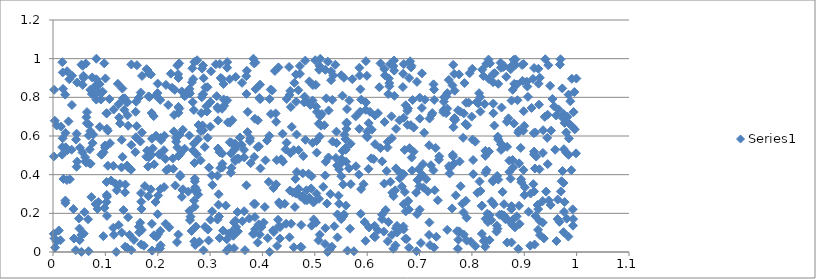
| Category | Series 0 |
|---|---|
| 0.5160474913337167 | 0.337 |
| 0.09617015705245335 | 0.082 |
| 0.9923903750390449 | 0.647 |
| 0.898281023670158 | 0.628 |
| 0.5591254495137288 | 0.529 |
| 0.8788413664616356 | 0.168 |
| 0.7127671088872979 | 0.377 |
| 0.5207826971131438 | 0.467 |
| 0.07418495562088356 | 0.817 |
| 0.5432654052218046 | 0.195 |
| 0.5081474548097578 | 0.943 |
| 0.23122237968736337 | 0.709 |
| 0.3169787551682983 | 0.183 |
| 0.23888999347084172 | 0.92 |
| 0.998885889811188 | 0.51 |
| 0.051441538219130334 | 0.539 |
| 0.6867950264548931 | 0.786 |
| 0.7003428091250541 | 0.798 |
| 0.8137104538907994 | 0.822 |
| 0.4638755823342835 | 0.918 |
| 0.014271669529187458 | 0.061 |
| 0.16392547301522664 | 0.131 |
| 0.48386084662999385 | 0.319 |
| 0.41611421413591265 | 0.714 |
| 0.8165534051275879 | 0.316 |
| 0.2219852981692495 | 0.127 |
| 0.6286246859752543 | 0.469 |
| 0.980182902136996 | 0.514 |
| 0.5465048586602486 | 0.427 |
| 0.26888465898112823 | 0.734 |
| 0.9289868362774674 | 0.428 |
| 0.5425743684143259 | 0.447 |
| 0.904747649500119 | 0.881 |
| 0.4972317677143836 | 0.256 |
| 0.5022900484589893 | 0.152 |
| 0.026913533181302074 | 0.935 |
| 0.5018402374626736 | 0.865 |
| 0.48200983674703113 | 0.58 |
| 0.43437397794785293 | 0.245 |
| 0.16758575639879836 | 0.825 |
| 0.9059215314509445 | 0.856 |
| 0.6445165085438551 | 0.363 |
| 0.848225839556311 | 0.394 |
| 0.45776737283951885 | 0.308 |
| 0.8673675034753366 | 0.049 |
| 0.3928753439997401 | 0.143 |
| 0.02354804728374016 | 0.253 |
| 0.6661456146922734 | 0.406 |
| 0.6423620065852867 | 0.857 |
| 0.6727755118670857 | 0.069 |
| 0.48175968026749183 | 0.99 |
| 0.2972427502199886 | 0.06 |
| 0.6695533480251125 | 0.117 |
| 0.14208918352991717 | 0.774 |
| 0.5264158143715961 | 0.732 |
| 0.14231449435864685 | 0.707 |
| 0.5614941263185844 | 0.739 |
| 0.9749478734390072 | 0.357 |
| 0.6698155773407001 | 0.972 |
| 0.0462499439189461 | 0.468 |
| 0.4424278551407389 | 0.25 |
| 0.271633494771119 | 0.036 |
| 0.7622133983896074 | 0.225 |
| 0.056687365258446754 | 0.864 |
| 0.4044717226755219 | 0.233 |
| 0.128133986302983 | 0.665 |
| 0.9827619591194117 | 0.7 |
| 0.27142372187796016 | 0.334 |
| 0.34041110181162393 | 0.567 |
| 0.858628139896921 | 0.311 |
| 0.3246781543375922 | 0.111 |
| 0.7634332874055841 | 0.503 |
| 0.14042899651690843 | 0.777 |
| 0.24586088202653633 | 0.831 |
| 0.5506197301472198 | 0.914 |
| 0.869822549361101 | 0.692 |
| 0.05441939195161549 | 0.001 |
| 0.20204904992688266 | 0.016 |
| 0.7668411060382312 | 0.693 |
| 0.11922566211693186 | 0.354 |
| 0.8784574600127304 | 0.436 |
| 0.7101605642942721 | 0.788 |
| 0.7243952046138283 | 0.719 |
| 0.6800469891440387 | 0.9 |
| 0.204041784334548 | 0.503 |
| 0.20483202731022032 | 0.787 |
| 0.06501076618932367 | 0.724 |
| 0.7887770125713018 | 0.772 |
| 0.3690895068747635 | 0.91 |
| 0.69974024174185 | 0.34 |
| 0.5608721459330146 | 0.67 |
| 0.19231547392342319 | 0.703 |
| 0.6151291307687713 | 0.706 |
| 0.5310625850628673 | 0.889 |
| 0.5040898804009066 | 0.724 |
| 0.3842550488166191 | 0.095 |
| 0.01995157591183616 | 0.378 |
| 0.08657769169448992 | 0.258 |
| 0.023647442385348882 | 0.266 |
| 0.10226751556213132 | 0.718 |
| 0.7157559767093521 | 0.313 |
| 0.8504350243161668 | 0.374 |
| 0.9653542186787719 | 0.738 |
| 0.5855189668198598 | 0.913 |
| 0.2408352356293808 | 0.976 |
| 0.3692961089751641 | 0.345 |
| 0.4202269776407961 | 0.112 |
| 0.2606275598536397 | 0.213 |
| 0.445205842773467 | 0.147 |
| 0.8281003494035778 | 0.423 |
| 0.9681286392194016 | 0.97 |
| 0.9609840386519294 | 0.706 |
| 0.492944353848661 | 0.329 |
| 0.5201014133307867 | 0.123 |
| 0.17541336736646163 | 0.341 |
| 0.13376644527218606 | 0.794 |
| 0.5684911881025859 | 0.56 |
| 0.2728434351056739 | 0.132 |
| 0.8832550699215823 | 0.968 |
| 0.6470820867274772 | 0.589 |
| 0.19983293324825735 | 0.195 |
| 0.7004954527130517 | 0.69 |
| 0.11100819530590189 | 0.37 |
| 0.994160744379721 | 0.724 |
| 0.863801572871504 | 0.17 |
| 0.10889489817656695 | 0.563 |
| 0.1380148396396258 | 0.349 |
| 0.2145633636056936 | 0.481 |
| 0.8931110382390102 | 0.538 |
| 0.19268003356132068 | 0.086 |
| 0.3039391390445202 | 0.211 |
| 0.6423124380492489 | 0.873 |
| 0.1646106853342384 | 0.101 |
| 0.5528822564993626 | 0.808 |
| 0.6949786338030213 | 0.88 |
| 0.2297097580858506 | 0.431 |
| 0.6552331101634565 | 0.637 |
| 0.8370217825005049 | 0.165 |
| 0.7278284886980528 | 0.84 |
| 0.8403962128402033 | 0.878 |
| 0.6391220886693384 | 0.055 |
| 0.7757754596767555 | 0.106 |
| 0.09914752032713248 | 0.551 |
| 0.8594910772701327 | 0.956 |
| 0.7691311222818694 | 0.293 |
| 0.200906322155457 | 0.292 |
| 0.6766608967041786 | 0.731 |
| 0.21171164388960118 | 0.527 |
| 0.1495388028722736 | 0.97 |
| 0.8502898424177602 | 0.87 |
| 0.2024455598627981 | 0.506 |
| 0.896706121588745 | 0.885 |
| 0.13460893616439917 | 0.217 |
| 0.115838791917242 | 0.737 |
| 0.5296197261146912 | 0.3 |
| 0.9188620540828366 | 0.313 |
| 0.5530700897507589 | 0.523 |
| 0.3530607829567656 | 0.107 |
| 0.32341298981843236 | 0.457 |
| 0.34683716237224993 | 0.531 |
| 0.05817710978111046 | 0.911 |
| 0.3488813154143958 | 0.906 |
| 0.45486561540001924 | 0.146 |
| 0.31815171937131514 | 0.517 |
| 0.2054990558264751 | 0.035 |
| 0.9964427188102639 | 0.634 |
| 0.6502840728676508 | 0.289 |
| 0.6353830752806258 | 0.217 |
| 0.0311610626857326 | 0.893 |
| 0.09954092345907817 | 0.541 |
| 0.4880577461002289 | 0.405 |
| 0.5339586292859538 | 0.571 |
| 0.4957916930036197 | 0.565 |
| 0.10299538141624986 | 0.187 |
| 0.990803139751708 | 0.896 |
| 0.2875465384756598 | 0.899 |
| 0.9069388965197343 | 0.802 |
| 0.14443109365969997 | 0.436 |
| 0.7454183412681402 | 0.723 |
| 0.7754573346771144 | 0.919 |
| 0.3905756669890822 | 0.542 |
| 0.32027742699424466 | 0.9 |
| 0.669793534152688 | 0.694 |
| 0.9930435932296257 | 0.136 |
| 0.2898198921892585 | 0.543 |
| 0.0890437311073532 | 0.868 |
| 0.7898784925233262 | 0.178 |
| 0.7529351361444985 | 0.822 |
| 0.38549033543381894 | 0.689 |
| 0.6412420843938199 | 0.898 |
| 0.8557094393062145 | 0.528 |
| 0.7277664527650842 | 0.023 |
| 0.92278826387854 | 0.494 |
| 0.677412698204643 | 0.261 |
| 0.2627592418157719 | 0.183 |
| 0.39569713690554187 | 0.791 |
| 0.45998485012497536 | 0.527 |
| 0.054396339936149674 | 0.969 |
| 0.5653939416307774 | 0.432 |
| 0.2483012398480593 | 0.324 |
| 0.6205030739863668 | 0.718 |
| 0.36173882179329186 | 0.159 |
| 0.669702321534722 | 0.247 |
| 0.8470437734888367 | 0.106 |
| 0.34972731973225835 | 0.129 |
| 0.295820691912106 | 0.116 |
| 0.5101152170094726 | 0.702 |
| 0.5870672850805322 | 0.842 |
| 0.23964664733678687 | 0.496 |
| 0.7370799990543205 | 0.477 |
| 0.21502749290350065 | 0.146 |
| 0.4304902103414102 | 0.955 |
| 0.3140775212782264 | 0.749 |
| 0.1278181677584258 | 0.352 |
| 0.6571849410481505 | 0.101 |
| 0.2676599819427584 | 0.894 |
| 0.6681986659356463 | 0.853 |
| 0.29541667375366776 | 0.591 |
| 0.3909114733745317 | 0.049 |
| 0.7956458986887804 | 0.925 |
| 0.050868496379963934 | 0.061 |
| 0.9752338337016192 | 0.714 |
| 0.25836940221235194 | 0.312 |
| 0.9957257659108527 | 0.828 |
| 0.969218281494824 | 0.997 |
| 0.23361494935856852 | 0.344 |
| 0.2513389103709913 | 0.534 |
| 0.8104681872536187 | 0.306 |
| 0.8714987426617473 | 0.473 |
| 0.45169785512974225 | 0.076 |
| 0.5006893211606837 | 0.992 |
| 0.5412260884766051 | 0.623 |
| 0.41302448046518114 | 0.601 |
| 0.38558540759235727 | 0.181 |
| 0.9417043012539531 | 0.312 |
| 0.7529102056548332 | 0.115 |
| 0.04365851513771701 | 0.01 |
| 0.4651357135091385 | 0.608 |
| 0.03654850122257358 | 0.912 |
| 0.003374960170800967 | 0.679 |
| 0.29507120769769013 | 0.852 |
| 0.07694055137947431 | 0.607 |
| 0.6470160000354761 | 0.088 |
| 0.07009927439325114 | 0.531 |
| 0.8218487654604174 | 0.91 |
| 0.12543360969417128 | 0.765 |
| 0.433631274281139 | 0.128 |
| 0.5200169661153189 | 0.942 |
| 0.2910380318669744 | 0.851 |
| 0.8399748398357505 | 0.365 |
| 0.22504576000953158 | 0.922 |
| 0.011116618831832237 | 0.111 |
| 0.017495180996623727 | 0.504 |
| 0.09283950037387911 | 0.504 |
| 0.315195806480009 | 0.74 |
| 0.524487382952105 | 0 |
| 0.007008232881922649 | 0.654 |
| 0.830661720581235 | 0.155 |
| 0.123875482949651 | 0.87 |
| 0.620461965117346 | 0.113 |
| 0.4598175828204688 | 0.025 |
| 0.24605823333379706 | 0.285 |
| 0.8779567132965074 | 0.839 |
| 0.9749534379046145 | 0.102 |
| 0.16888233264995067 | 0.223 |
| 0.7976996871791326 | 0.054 |
| 0.4858062249109364 | 0.779 |
| 0.8808032482029828 | 0.87 |
| 0.16969893811262626 | 0.114 |
| 0.03615307680729607 | 0.76 |
| 0.5715945716080069 | 0.894 |
| 0.8613049858235846 | 0.247 |
| 0.5090588506498519 | 0.963 |
| 0.3550713572500811 | 0.481 |
| 0.35699600953956856 | 0.592 |
| 0.27006518773886623 | 0.461 |
| 0.6003519915042398 | 0.623 |
| 0.10270330255344684 | 0.295 |
| 0.469063429481822 | 0.327 |
| 0.3327974064358721 | 0.982 |
| 0.32333862595797835 | 0.509 |
| 0.2864035717593877 | 0.965 |
| 0.3818654988153457 | 0.094 |
| 0.7884715547880564 | 0.265 |
| 0.1308672265532792 | 0.437 |
| 0.4463411103876339 | 0.792 |
| 0.18440315167423849 | 0.802 |
| 0.05056367064041212 | 0.121 |
| 0.2847482210653076 | 0.949 |
| 0.8248048724806967 | 0.062 |
| 0.3981471000494605 | 0.129 |
| 0.6734767566700215 | 0.21 |
| 0.19996027802215033 | 0.871 |
| 0.39469660803289497 | 0.091 |
| 0.18319324629977196 | 0.924 |
| 0.9011738566486307 | 0.335 |
| 0.023256224536537196 | 0.814 |
| 0.6985202825800196 | 0.429 |
| 0.9272997631414656 | 0.871 |
| 0.600496804257591 | 0.594 |
| 0.894524486939494 | 0.361 |
| 0.14952102701992398 | 0.554 |
| 0.056969060203974076 | 0.963 |
| 0.43842421718684355 | 0.612 |
| 0.2694738156720594 | 0.266 |
| 0.16653644974326176 | 0.151 |
| 0.7670793743864562 | 0.834 |
| 0.2709828725751994 | 0.366 |
| 0.1208106366021321 | 0 |
| 0.7281010862305417 | 0.786 |
| 0.49568842099406674 | 0.784 |
| 0.8190396635869489 | 0.094 |
| 0.23948441779423135 | 0.75 |
| 0.30436015564496466 | 0.347 |
| 0.13275958174271907 | 0.492 |
| 0.347809619524413 | 0.471 |
| 0.9726278440588686 | 0.846 |
| 0.771581626974921 | 0.108 |
| 0.6799053029132318 | 0.022 |
| 0.831676544788053 | 0.995 |
| 0.2064527116754289 | 0.579 |
| 0.1896499647613924 | 0.007 |
| 0.5973174116906521 | 0.735 |
| 0.2539689276889576 | 0.812 |
| 0.7045289284485426 | 0.924 |
| 0.9571639279005842 | 0.753 |
| 0.4508486974684537 | 0.957 |
| 0.06692934471110834 | 0.169 |
| 0.815909478625998 | 0.801 |
| 0.683348130637034 | 0.656 |
| 0.06802094630610855 | 0.602 |
| 0.8553141068305042 | 0.952 |
| 0.9300199173017595 | 0.088 |
| 0.029642715605264103 | 0.675 |
| 0.7781662520969763 | 0.726 |
| 0.28733792452560636 | 0.009 |
| 0.6718831538702215 | 0.311 |
| 0.9359147373889912 | 0.63 |
| 0.27080704743544537 | 0.379 |
| 0.8272430935822584 | 0.054 |
| 0.8912023832098556 | 0.145 |
| 0.651175929641434 | 0.991 |
| 0.6605683099838938 | 0.415 |
| 0.6479803578562588 | 0.307 |
| 0.6978052739418573 | 0.376 |
| 0.34763961310599034 | 0.56 |
| 0.5951255803245962 | 0.155 |
| 0.17871630143313555 | 0.946 |
| 0.7831721456663625 | 0.591 |
| 0.06885527749311571 | 0.658 |
| 0.4619466549278327 | 0.233 |
| 0.12638935672683194 | 0.695 |
| 0.12170842594978981 | 0.319 |
| 0.09491017696626791 | 0.829 |
| 0.11618112882881859 | 0.089 |
| 0.2646431597955212 | 0.109 |
| 0.09784340277218828 | 0.976 |
| 0.07325189888176786 | 0.284 |
| 0.18675792579572936 | 0.324 |
| 0.45351831289544176 | 0.511 |
| 0.16854728103935301 | 0.26 |
| 0.650036609704758 | 0.962 |
| 0.7088853075078477 | 0.617 |
| 0.03219710776726192 | 0.376 |
| 0.04003360642642828 | 0.07 |
| 0.6284006847252757 | 0.193 |
| 0.5309788797945314 | 0.935 |
| 0.51803318071659 | 0.656 |
| 0.9296853460210421 | 0.901 |
| 0.36658406106887786 | 0.01 |
| 0.5372916670756805 | 0.133 |
| 0.6735970478061628 | 0.759 |
| 0.19679150838179538 | 0.602 |
| 0.6850578520837944 | 0.489 |
| 0.17008010851534283 | 0.911 |
| 0.6809615487753453 | 0.537 |
| 0.045053675308869834 | 0.441 |
| 0.8753336812994185 | 0.222 |
| 0.8375936473239558 | 0.262 |
| 0.08164369475475719 | 0.862 |
| 0.8495161779024559 | 0.597 |
| 0.917183401545911 | 0.351 |
| 0.8800631287835413 | 0.665 |
| 0.528423706028977 | 0.012 |
| 0.9374902867449658 | 0.07 |
| 0.345660660344038 | 0.02 |
| 0.824348266542112 | 0.765 |
| 0.323439766440895 | 0.437 |
| 0.44418121442076497 | 0.531 |
| 0.13247364694846708 | 0.846 |
| 0.8528757800839457 | 0.193 |
| 0.963880348047381 | 0.271 |
| 0.4216448241569155 | 0.104 |
| 0.30071782806299296 | 0.167 |
| 0.6076774266423779 | 0.484 |
| 0.10286952712175035 | 0.637 |
| 0.3836723746024989 | 0.249 |
| 0.20547441863621885 | 0.59 |
| 0.2795370415685192 | 0.054 |
| 0.1683698710105307 | 0.039 |
| 0.3299490447380561 | 0.24 |
| 0.46897123646650607 | 0.527 |
| 0.9139200133723082 | 0.745 |
| 0.24296921735546417 | 0.391 |
| 0.6716193967894878 | 0.528 |
| 0.41575961734003797 | 0.84 |
| 0.826104817979002 | 0.172 |
| 0.7909610075081339 | 0.655 |
| 0.24138965574885907 | 0.605 |
| 0.6149737833819521 | 0.077 |
| 0.8569906977975642 | 0.193 |
| 0.35229186761567577 | 0.484 |
| 0.23687604639698667 | 0.051 |
| 0.17984516950711704 | 0.525 |
| 0.1869459057845515 | 0.919 |
| 0.7574187230055178 | 0.407 |
| 0.47977983258901546 | 0.774 |
| 0.4460203297958303 | 0.565 |
| 0.28606313682450313 | 0.814 |
| 0.7044642934123558 | 0.745 |
| 0.23761933564784965 | 0.965 |
| 0.5866683278944322 | 0.725 |
| 0.8777225424323545 | 0.476 |
| 0.6387521773593108 | 0.541 |
| 0.6754095427323042 | 0.067 |
| 0.9082136269626165 | 0.208 |
| 0.7562983639475634 | 0.444 |
| 0.2613956958475674 | 0.82 |
| 0.28418251842723774 | 0.8 |
| 0.4209025043203669 | 0.331 |
| 0.5513688865390692 | 0.481 |
| 0.22882730610412538 | 0.484 |
| 0.0635607361454843 | 0.462 |
| 0.6150896944945875 | 0.558 |
| 0.6405078566713799 | 0.155 |
| 0.15459181945530032 | 0.062 |
| 0.08187374565465644 | 0.856 |
| 0.06386510061728434 | 0.697 |
| 0.839939479589058 | 0.371 |
| 0.8870814634508708 | 0.785 |
| 0.6390742154956429 | 0.57 |
| 0.1958535835155274 | 0.258 |
| 0.0149356867256627 | 0.649 |
| 0.4022760473932533 | 0.152 |
| 0.18235212358293074 | 0.805 |
| 0.11484830745693508 | 0.125 |
| 0.6548874630980315 | 0.433 |
| 0.6125129183178596 | 0.48 |
| 0.1033068978502788 | 0.286 |
| 0.8856037798920223 | 0.185 |
| 0.8589752392401347 | 0.537 |
| 0.5603439172634667 | 0.637 |
| 0.2691186276788514 | 0.56 |
| 0.019219271684630446 | 0.844 |
| 0.45418904041043384 | 0.75 |
| 0.09247413655775782 | 0.504 |
| 0.7629756131911792 | 0.862 |
| 0.16029194987780782 | 0.966 |
| 0.10047352910613738 | 0.549 |
| 0.9770794814875846 | 0.258 |
| 0.46857486589279296 | 0.837 |
| 0.6141573629054858 | 0.135 |
| 0.2822003437319317 | 0.627 |
| 0.2866953437699181 | 0.63 |
| 0.27711145982672203 | 0.584 |
| 0.48938826633109933 | 0.281 |
| 0.3151420783906138 | 0.535 |
| 0.3694908725056497 | 0.818 |
| 0.8007114219355559 | 0.947 |
| 0.7680746477185068 | 0.683 |
| 0.6339319712132493 | 0.914 |
| 0.9437614926747709 | 0.591 |
| 0.9187034859591503 | 0.951 |
| 0.8939011450793218 | 0.376 |
| 0.4730619367290366 | 0.027 |
| 0.3379489651533709 | 0.669 |
| 0.3337282040417441 | 0.67 |
| 0.36103176026456174 | 0.875 |
| 0.34458976906588334 | 0.084 |
| 0.4559970263710701 | 0.647 |
| 0.6838612808895832 | 0.955 |
| 0.651935648049458 | 0.808 |
| 0.37013783304407943 | 0.937 |
| 0.32690677444381566 | 0.757 |
| 0.37194316250544646 | 0.725 |
| 0.27729427743040647 | 0.297 |
| 0.666141888805281 | 0.339 |
| 0.98984344308076 | 0.423 |
| 0.1884377102068252 | 0.719 |
| 0.4938642200226525 | 0.136 |
| 0.03899384547073892 | 0.222 |
| 0.017858397983463115 | 0.982 |
| 0.6696623102649144 | 0.403 |
| 0.9757018551527595 | 0.532 |
| 0.953800268538847 | 0.792 |
| 0.20054980010632228 | 0.092 |
| 0.06457910748007689 | 0.666 |
| 0.1830741095858378 | 0.489 |
| 0.34242533610543424 | 0.682 |
| 0.5586405696086771 | 0.538 |
| 0.8987797148140699 | 0.728 |
| 0.718121052093799 | 0.088 |
| 0.13624668517031746 | 0.735 |
| 0.753049746148201 | 0.742 |
| 0.0801617530345593 | 0.815 |
| 0.4100643458913804 | 0.072 |
| 0.42736247099144165 | 0.475 |
| 0.017680936892617738 | 0.542 |
| 0.09149051657453278 | 0.789 |
| 0.8490006037264518 | 0.121 |
| 0.45234106375913063 | 0.318 |
| 0.7765035856528072 | 0.468 |
| 0.23525906117853101 | 0.57 |
| 0.6692059471303661 | 0.132 |
| 0.25151690888117284 | 0.806 |
| 0.9769524421375821 | 0.668 |
| 0.31263911345365936 | 0.806 |
| 0.928181800549754 | 0.762 |
| 0.8822914030559325 | 0.128 |
| 0.16812652174356724 | 0.305 |
| 0.8255677477981095 | 0.497 |
| 0.5885541467543909 | 0.788 |
| 0.7643189195984136 | 0.968 |
| 0.8405358872875495 | 0.92 |
| 0.7508886711651549 | 0.718 |
| 0.42521022019225996 | 0.717 |
| 0.4715283431584083 | 0.921 |
| 0.7199213750076356 | 0.036 |
| 0.6859320004976518 | 0.421 |
| 0.9673809792911233 | 0.156 |
| 0.13682376734604473 | 0.795 |
| 0.5026796743158736 | 0.752 |
| 0.9120693023369556 | 0.302 |
| 0.07173138837924453 | 0.457 |
| 0.840844293173382 | 0.768 |
| 0.9268215420992998 | 0.948 |
| 0.9503366324481349 | 0.243 |
| 0.9000512827512109 | 0.652 |
| 0.8429175452305722 | 0.654 |
| 0.6232243053923007 | 0.852 |
| 0.23953479927263988 | 0.72 |
| 0.6621647213358799 | 0.381 |
| 0.36498273369543943 | 0.211 |
| 0.37739752738240495 | 0.46 |
| 0.6332981542652428 | 0.672 |
| 0.8565557456654673 | 0.747 |
| 0.5504929050423495 | 0.17 |
| 0.26149069916138923 | 0.165 |
| 0.34766263537315156 | 0.478 |
| 0.18159559868196207 | 0.442 |
| 0.6317017741305389 | 0.106 |
| 0.33268976107710446 | 0.784 |
| 0.3748808705692527 | 0.173 |
| 0.8655556623411028 | 0.906 |
| 0.0028810809060071385 | 0.07 |
| 0.5987579136181322 | 0.599 |
| 0.524803617347733 | 0.984 |
| 0.18887994361397697 | 0.146 |
| 0.061310019570750884 | 0.491 |
| 0.9842514155843827 | 0.08 |
| 0.7900091417592707 | 0.059 |
| 0.24133660069920204 | 0.742 |
| 0.42618817512252116 | 0.673 |
| 0.4360127010413465 | 0.48 |
| 0.9846752905690923 | 0.503 |
| 0.08268762339285685 | 0.894 |
| 0.14355405317030934 | 0.653 |
| 0.5592576939990817 | 0.24 |
| 0.9002202103223265 | 0.294 |
| 0.10467030298518287 | 0.627 |
| 0.5232741367668716 | 0.251 |
| 0.944718861211455 | 0.455 |
| 0.9166296895466101 | 0.895 |
| 0.16963743055166314 | 0.618 |
| 0.7844230638163165 | 0.09 |
| 0.814600131926526 | 0.365 |
| 0.07121495516387877 | 0.839 |
| 0.9853609415048381 | 0.665 |
| 0.7508808909864255 | 0.805 |
| 0.806546806978774 | 0.571 |
| 0.027623009079437044 | 0.527 |
| 0.5091132999168371 | 0.597 |
| 0.9994814429584244 | 0.897 |
| 0.30314340893465497 | 0.396 |
| 0.17820145081424943 | 0.493 |
| 0.4977716204098216 | 0.168 |
| 0.08729607493330471 | 0.829 |
| 0.34072113370637047 | 0.104 |
| 0.1635631631778941 | 0.797 |
| 0.08279067249718919 | 1 |
| 0.1599812447953478 | 0.651 |
| 0.3140353922670488 | 0.395 |
| 0.5074955400445301 | 0.664 |
| 0.4313381113893363 | 0.134 |
| 0.8345832896693818 | 0.976 |
| 0.5597216678137339 | 0.466 |
| 0.8320400593388099 | 0.896 |
| 0.7660661539229232 | 0.457 |
| 0.5032190717355557 | 0.574 |
| 0.06786089788703287 | 0.004 |
| 0.9924164385158337 | 0.221 |
| 0.4313384478958757 | 0.257 |
| 0.6616030940967572 | 0.681 |
| 0.8556670953897146 | 0.557 |
| 0.4963117511686477 | 0.863 |
| 0.9445669483885895 | 0.71 |
| 0.37593385443356 | 0.574 |
| 0.9185343821374574 | 0.505 |
| 0.9187076074303213 | 0.519 |
| 0.9933104015535053 | 0.17 |
| 0.5746061154433393 | 0.004 |
| 0.7857699230663643 | 0.874 |
| 0.10008622020514768 | 0.898 |
| 0.9810463109727879 | 0.172 |
| 0.7655999562030907 | 0.686 |
| 0.8562407724854503 | 0.558 |
| 0.5608343722121996 | 0.665 |
| 0.26032548604313765 | 0.603 |
| 0.35717566254272337 | 0.592 |
| 0.14206319537827095 | 0.021 |
| 0.3912739220258753 | 0.681 |
| 0.8756545604271216 | 0.783 |
| 0.5403640415992502 | 0.486 |
| 0.2668719643814855 | 0.776 |
| 0.875683351702146 | 0.237 |
| 0.03549614019782377 | 0.529 |
| 0.637325474053408 | 0.419 |
| 0.9741284004801626 | 0.692 |
| 0.41210272856994046 | 0.363 |
| 0.08933466054853367 | 0.647 |
| 0.9196588388394338 | 0.039 |
| 0.5391878339977811 | 0.969 |
| 0.8751419071502422 | 0.961 |
| 0.28195230430499574 | 0.474 |
| 0.9265805669496033 | 0.222 |
| 0.15729183750460052 | 0.516 |
| 0.9801484906787763 | 0.618 |
| 0.6770132521587785 | 0.658 |
| 0.19312905020662252 | 0.453 |
| 0.8611781848117848 | 0.189 |
| 0.36505246961157567 | 0.489 |
| 0.8738694761413021 | 0.379 |
| 0.3160851485432664 | 0.244 |
| 0.8797286466762014 | 0.994 |
| 0.42373767993878797 | 0.937 |
| 0.1737478609520401 | 0.032 |
| 0.5452682821277801 | 0.291 |
| 0.21282484927003542 | 0.601 |
| 0.984534219117494 | 0.814 |
| 0.5851427020414036 | 0.953 |
| 0.242628306574733 | 0.398 |
| 0.13754468444713752 | 0.309 |
| 0.062395172961206335 | 0.469 |
| 0.23755810868940208 | 0.54 |
| 0.7066506821588776 | 0.455 |
| 0.318179828837841 | 0.072 |
| 0.3713892005285365 | 0.62 |
| 0.8260894336484931 | 0.41 |
| 0.9401784148616881 | 0.997 |
| 0.8714404125323878 | 0.414 |
| 0.8856576057289334 | 0.866 |
| 0.2698671154559493 | 0.983 |
| 0.1255600185855148 | 0.139 |
| 0.14629508934679014 | 0.088 |
| 0.2121540156285262 | 0.336 |
| 0.32300477807069694 | 0.895 |
| 0.7662098456092696 | 0.921 |
| 0.7308777104995958 | 0.538 |
| 0.5975452432618342 | 0.987 |
| 0.9391712838285222 | 0.699 |
| 0.5876883452031304 | 0.198 |
| 0.19955942180198882 | 0.822 |
| 0.898721361225317 | 0.972 |
| 0.20427352552751 | 0.018 |
| 0.24716762291113892 | 0.321 |
| 0.8191468421090584 | 0.24 |
| 0.3647322055270922 | 0.529 |
| 0.9590082212619458 | 0.529 |
| 0.05880107084266217 | 0.095 |
| 0.4136746017882744 | 0.791 |
| 0.5117874779931999 | 0.654 |
| 0.45157728718778867 | 0.812 |
| 0.3005608103721371 | 0.776 |
| 0.6035930737831869 | 0.127 |
| 0.1582453074109751 | 0.593 |
| 0.929498117257534 | 0.161 |
| 0.39340280791861093 | 0.547 |
| 0.5565736710159493 | 0.607 |
| 0.32551578263371284 | 0.869 |
| 0.5506198619613046 | 0.392 |
| 0.18026685090209127 | 0.941 |
| 0.476433683489494 | 0.289 |
| 0.7217711455216618 | 0.449 |
| 0.546446294823258 | 0.25 |
| 0.04408814562151997 | 0.581 |
| 0.23499152701011294 | 0.59 |
| 0.7643032963968146 | 0.494 |
| 0.026443593727781267 | 0.372 |
| 0.6402756694907603 | 0.817 |
| 0.7734828193232965 | 0.733 |
| 0.29023497872598614 | 0.13 |
| 0.726450539481387 | 0.422 |
| 0.0185557424424575 | 0.588 |
| 0.40572182932417733 | 0.474 |
| 0.7577454577968634 | 0.434 |
| 0.2157208864308674 | 0.864 |
| 0.4278974437970837 | 0.031 |
| 0.5542338179037025 | 0.349 |
| 0.08130752606708724 | 0.248 |
| 0.8409654360800205 | 0.718 |
| 0.06973632978230893 | 0.459 |
| 0.14147832936242954 | 0.447 |
| 0.4729452784346976 | 0.287 |
| 0.34557668206185366 | 0.153 |
| 0.951199060285713 | 0.628 |
| 0.3484522031942401 | 0.539 |
| 0.9637025647892095 | 0.17 |
| 0.4937937830131539 | 0.392 |
| 0.889609185688697 | 0.628 |
| 0.43923913793735436 | 0.467 |
| 0.5326179485111558 | 0.028 |
| 0.4185826182311062 | 0.835 |
| 0.15778757890823847 | 0.725 |
| 0.6464270304993562 | 0.702 |
| 0.9493967899154652 | 0.86 |
| 0.5103137440551788 | 0.999 |
| 0.8023102847746597 | 0.475 |
| 0.7817100523880038 | 0.25 |
| 0.3828071026587536 | 1 |
| 0.26532105333685585 | 0.878 |
| 0.7025697558118588 | 0.047 |
| 0.8900463009276665 | 0.239 |
| 0.10236980099413973 | 0.717 |
| 0.33765171412713035 | 0.567 |
| 0.2165331287168636 | 0.423 |
| 0.3152995042061755 | 0.681 |
| 0.006790810282093607 | 0.054 |
| 0.2325782494656532 | 0.839 |
| 0.33735546602227595 | 0.894 |
| 0.1023878985990807 | 0.362 |
| 0.5431920694141841 | 0.076 |
| 0.3005025071612839 | 0.648 |
| 0.463974887918536 | 0.302 |
| 0.46093068379697777 | 0.875 |
| 0.8956837233464522 | 0.967 |
| 0.9614808909108395 | 0.057 |
| 0.33532585527536707 | 0.095 |
| 0.945849662755917 | 0.966 |
| 0.31903924424352337 | 0.515 |
| 0.18891743533427163 | 0.586 |
| 0.3522739061195217 | 0.207 |
| 0.8188000849174966 | 0.238 |
| 0.8616903127875083 | 0.961 |
| 0.05400549075643235 | 0.088 |
| 0.28554238559755385 | 0.655 |
| 0.6500641047992813 | 0.017 |
| 0.6819845910511425 | 0.986 |
| 0.9114079722259076 | 0.032 |
| 0.4297814464544727 | 0.167 |
| 0.8475911840483451 | 0.137 |
| 0.0015284210465188464 | 0.094 |
| 0.2696775679127872 | 0.32 |
| 0.653374620840861 | 0.319 |
| 0.4260681697988 | 0.35 |
| 0.8326244926326393 | 0.52 |
| 0.6888003150923531 | 0.643 |
| 0.38646431665842007 | 0.981 |
| 0.7464580821029602 | 0.777 |
| 0.5029845476028795 | 0.302 |
| 0.5930725960146 | 0.351 |
| 0.4896225211383268 | 0.882 |
| 0.7183599804099752 | 0.552 |
| 0.987868285561232 | 0.78 |
| 0.7937872750510679 | 0.773 |
| 0.2208547225036337 | 0.431 |
| 0.9698143210860716 | 0.313 |
| 0.8830448217111773 | 0.996 |
| 0.5968755797768134 | 0.058 |
| 0.6942054596110031 | 0.004 |
| 0.47699081390458875 | 0.407 |
| 0.5489343268370115 | 0.456 |
| 0.5093476737162412 | 0.09 |
| 0.7732047220004339 | 0.016 |
| 0.6088111031627031 | 0.633 |
| 0.784528592660622 | 0.717 |
| 0.6025489710843543 | 0.43 |
| 0.06003805952100094 | 0.206 |
| 0.8161671520237694 | 0.726 |
| 0.36013733650710034 | 0.554 |
| 0.6935821273009292 | 0.307 |
| 0.41378147243729313 | 0.001 |
| 0.274447767853079 | 0.505 |
| 0.22005020406216624 | 0.76 |
| 0.5785403827469046 | 0.444 |
| 0.783919942263351 | 0.205 |
| 0.5780340644944348 | 0.702 |
| 0.48492154010530064 | 0.268 |
| 0.9851049075757542 | 0.587 |
| 0.310976708475904 | 0.971 |
| 0.33180162404827984 | 0.007 |
| 0.38596681845526915 | 0.248 |
| 0.5540969143844748 | 0.184 |
| 0.23936465210039126 | 0.09 |
| 0.2748577115296371 | 0.319 |
| 0.921192798106991 | 0.186 |
| 0.5623741577137207 | 0.007 |
| 0.023794604000565656 | 0.616 |
| 0.49876594161080656 | 0.261 |
| 0.3227912049320286 | 0.741 |
| 0.19041563927442307 | 0.536 |
| 0.4531024545185548 | 0.833 |
| 0.5416060100747555 | 0.564 |
| 0.8672144207906022 | 0.544 |
| 0.4333902914745327 | 0.07 |
| 0.5994593747977635 | 0.911 |
| 0.29402470453924745 | 0.727 |
| 0.04605836177040812 | 0.876 |
| 0.4714943541802341 | 0.962 |
| 0.13142252455182335 | 0.1 |
| 0.7741492780451403 | 0.064 |
| 0.5849434697870111 | 0.637 |
| 0.8418636842435866 | 0.246 |
| 0.19636021213114363 | 0.809 |
| 0.06260003597167385 | 0.975 |
| 0.49145375607619946 | 0.761 |
| 0.6549187638154368 | 0.123 |
| 0.656962069457294 | 0.135 |
| 0.684511551249748 | 0.964 |
| 0.14911153776291086 | 0.426 |
| 0.6435321703351305 | 0.972 |
| 0.8502252676792902 | 0.583 |
| 0.6283050122729568 | 0.17 |
| 0.7783704698063671 | 0.34 |
| 0.08492935683130354 | 0.223 |
| 0.6130973845050671 | 0.08 |
| 0.9713119778009849 | 0.366 |
| 0.158929786125235 | 0.777 |
| 0.09824285209884276 | 0.228 |
| 0.7458173752354221 | 0.733 |
| 0.9203695763407068 | 0.432 |
| 0.004050191633159006 | 0.023 |
| 0.2830715935261362 | 0.719 |
| 0.925411325497269 | 0.243 |
| 0.2480285000591761 | 0.632 |
| 0.33642712711335954 | 0.021 |
| 0.9730967671808737 | 0.419 |
| 0.7319704941837741 | 0.079 |
| 0.38589626633343455 | 0.118 |
| 0.056390611027086535 | 0.515 |
| 0.5840615314702475 | 0.401 |
| 0.9352004194807152 | 0.263 |
| 0.10769265145833828 | 0.791 |
| 0.7348589314627855 | 0.268 |
| 0.8293951451606889 | 0.198 |
| 0.3396050803922803 | 0.41 |
| 0.7470211123539502 | 0.801 |
| 0.3326553804764978 | 0.953 |
| 0.2753130340631005 | 0.992 |
| 0.6327473161167202 | 0.354 |
| 0.5219825924654985 | 0.795 |
| 0.8435497005564766 | 0.925 |
| 0.8066365556676628 | 0.03 |
| 0.13788877863499382 | 0.028 |
| 0.26978770519449813 | 0.054 |
| 0.632715154522455 | 0.946 |
| 0.10203277501170549 | 0.258 |
| 0.46294389444632456 | 0.378 |
| 0.7267930317526586 | 0.867 |
| 0.20512410746432064 | 0.325 |
| 0.25926567649301047 | 0.832 |
| 0.09669113293677634 | 0.516 |
| 0.9355465054238159 | 0.513 |
| 0.3018009145377093 | 0.935 |
| 0.827566075722669 | 0.973 |
| 0.6952941476478027 | 0.196 |
| 0.07485608306308222 | 0.903 |
| 0.31415340961353233 | 0.168 |
| 0.8739925102588255 | 0.945 |
| 0.7558698847602786 | 0.89 |
| 0.5334299493238306 | 0.787 |
| 0.6515668005613695 | 0.938 |
| 0.7878129475347282 | 0.663 |
| 0.5195360435384424 | 0.041 |
| 0.5659803573118676 | 0.784 |
| 0.13126336845266717 | 0.58 |
| 0.9210262336041248 | 0.618 |
| 0.22747965537413795 | 0.849 |
| 0.38429287700225023 | 0.975 |
| 0.33969538226057605 | 0.51 |
| 0.8025117968180474 | 0.403 |
| 0.4740259305215686 | 0.14 |
| 0.6797276958462415 | 0.22 |
| 0.7375804306382038 | 0.495 |
| 0.2979479456370152 | 0.436 |
| 0.5687137601493638 | 0.351 |
| 0.7002191398483473 | 0.219 |
| 0.6028935707926036 | 0.667 |
| 0.01863085859432112 | 0.929 |
| 0.8257838377051895 | 0.523 |
| 0.8547489739522248 | 0.979 |
| 0.8901626375233624 | 0.458 |
| 0.48107882655352596 | 0.269 |
| 0.115275860165303 | 0.446 |
| 0.5036335462256399 | 0.514 |
| 0.6253869541070578 | 0.537 |
| 0.28668277559426225 | 0.817 |
| 0.8337453569569566 | 0.062 |
| 0.31634356440277167 | 0.299 |
| 0.5134751554530701 | 0.714 |
| 0.46570666292748497 | 0.414 |
| 0.3193606285242181 | 0.434 |
| 0.04954096933534902 | 0.173 |
| 0.2396288902389493 | 0.9 |
| 0.267720426353238 | 0.525 |
| 0.555864921028237 | 0.195 |
| 0.5261386730511274 | 0.489 |
| 0.688698888244906 | 0.519 |
| 0.39539555648978386 | 0.865 |
| 0.9351478668868056 | 0.152 |
| 0.00218721184311621 | 0.839 |
| 0.9760161856524678 | 0.208 |
| 0.6777929585428556 | 0.743 |
| 0.18218560365953207 | 0.289 |
| 0.024181181858709988 | 0.542 |
| 0.393993938531077 | 0.797 |
| 0.8117345435156411 | 0.769 |
| 0.5976089585649896 | 0.773 |
| 0.20494702484381833 | 0.109 |
| 0.1495215908955081 | 0.01 |
| 0.24322271790888672 | 0.507 |
| 0.7231842379076225 | 0.71 |
| 0.8667273028594704 | 0.674 |
| 0.7191033459504049 | 0.69 |
| 0.5583770486157766 | 0.585 |
| 0.8195872024953169 | 0.943 |
| 0.33187536675701346 | 0.066 |
| 0.08272923507606433 | 0.788 |
| 0.8254360340598023 | 0.027 |
| 0.14333883085510568 | 0.18 |
| 0.7647317998840308 | 0.645 |
| 0.32585422497028615 | 0.789 |
| 0.3765026448816051 | 0.588 |
| 0.6054097627131716 | 0.725 |
| 0.04509367571009493 | 0.612 |
| 0.5671903882243139 | 0.12 |
| 0.26071009166759374 | 0.844 |
| 0.8756380769823027 | 0.049 |
| 0.4743056845881144 | 0.024 |
| 0.6541295162303641 | 0.035 |
| 0.07561301089354922 | 0.563 |
| 0.26611178107119104 | 0.95 |
| 0.6255402024916462 | 0.976 |
| 0.7044846194651141 | 0.401 |
| 0.6781481243694896 | 0.265 |
| 0.808958392741176 | 0.776 |
| 0.10477756329449084 | 0.446 |
| 0.8227016245687298 | 0.057 |
| 0.3960856827874477 | 0.432 |
| 0.47797045146610684 | 0.496 |
| 0.5883463823574006 | 0.325 |
| 0.5198645399997478 | 0.396 |
| 0.16685401393153731 | 0.571 |
| 0.4086129184960344 | 0.576 |
| 0.19747973639668337 | 0.078 |
| 0.2929005065454131 | 0.753 |
| 0.38693268357732835 | 0.843 |
| 0.07105275350430396 | 0.626 |
| 0.696034691292427 | 0.372 |
| 0.877791726338687 | 0.138 |
| 0.9181095590283436 | 0.615 |
| 0.18897230581226565 | 0.007 |
| 0.8885947382560854 | 0.618 |
| 0.0015874223215666117 | 0.494 |
| 0.8339094184558331 | 0.191 |
| 0.799551369475899 | 0.7 |
| 0.5080183634865707 | 0.275 |
| 0.5353785418020596 | 0.913 |
| 0.3409907434585244 | 0.435 |
| 0.23075379389452078 | 0.624 |
| 0.7289689050681202 | 0.319 |
| 0.27787485628182707 | 0.657 |
| 0.05832077682209591 | 0.899 |
| 0.8012768796891047 | 0.581 |
| 0.7188216974959336 | 0.153 |
| 0.31853392618859044 | 0.972 |
| 0.7075560920423556 | 0.333 |
| 0.8885719538206653 | 0.016 |
| 0.4645575483448776 | 0.778 |
| 0.6685827591751407 | 0.922 |
| 0.27050168974530675 | 0.234 |
| 0.8984841393555208 | 0.425 |
| 0.9467942774400613 | 0.267 |
| 0.4804688690398521 | 0.804 |
| 0.3841830759771617 | 0.492 |
| 0.9263382007768305 | 0.115 |
| 0.34837875827852216 | 0.162 |
| 0.5070162825304707 | 0.06 |
| 0.8694826548072159 | 0.164 |
| 0.5555752909314037 | 0.901 |
| 0.18794518598663879 | 0.503 |